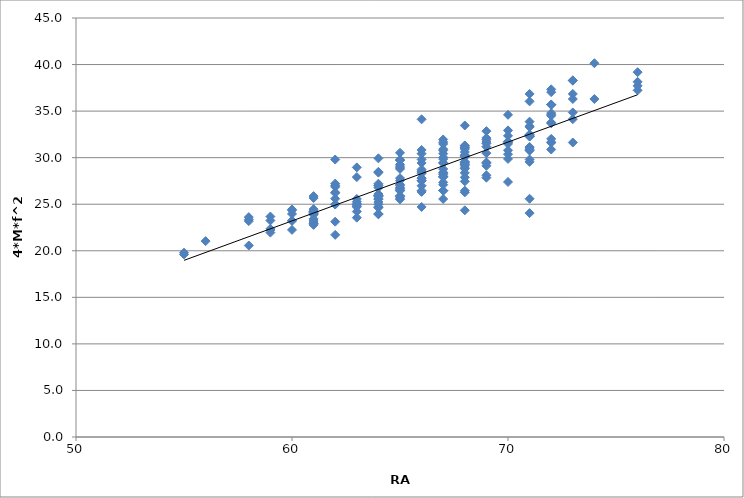
| Category | Series 0 |
|---|---|
| 55.0 | 19.792 |
| 55.0 | 19.607 |
| 56.0 | 21.037 |
| 58.0 | 23.615 |
| 58.0 | 23.348 |
| 58.0 | 23.187 |
| 58.0 | 20.568 |
| 59.0 | 23.675 |
| 59.0 | 23.254 |
| 59.0 | 22.359 |
| 59.0 | 22.222 |
| 59.0 | 21.955 |
| 60.0 | 24.439 |
| 60.0 | 24.349 |
| 60.0 | 23.959 |
| 60.0 | 23.254 |
| 60.0 | 23.198 |
| 60.0 | 22.243 |
| 61.0 | 25.872 |
| 61.0 | 25.661 |
| 61.0 | 24.471 |
| 61.0 | 24.254 |
| 61.0 | 24.226 |
| 61.0 | 24.185 |
| 61.0 | 24.096 |
| 61.0 | 23.989 |
| 61.0 | 23.874 |
| 61.0 | 23.424 |
| 61.0 | 23.202 |
| 61.0 | 22.965 |
| 61.0 | 22.964 |
| 61.0 | 22.781 |
| 62.0 | 29.801 |
| 62.0 | 27.212 |
| 62.0 | 27.02 |
| 62.0 | 26.861 |
| 62.0 | 26.277 |
| 62.0 | 26.21 |
| 62.0 | 25.595 |
| 62.0 | 25.007 |
| 62.0 | 24.966 |
| 62.0 | 23.128 |
| 62.0 | 21.71 |
| 63.0 | 28.956 |
| 63.0 | 27.913 |
| 63.0 | 25.566 |
| 63.0 | 25.275 |
| 63.0 | 25.078 |
| 63.0 | 24.948 |
| 63.0 | 24.807 |
| 63.0 | 24.711 |
| 63.0 | 24.215 |
| 63.0 | 23.557 |
| 64.0 | 29.927 |
| 64.0 | 28.478 |
| 64.0 | 28.396 |
| 64.0 | 27.205 |
| 64.0 | 27.04 |
| 64.0 | 26.985 |
| 64.0 | 26.784 |
| 64.0 | 26.093 |
| 64.0 | 25.976 |
| 64.0 | 25.934 |
| 64.0 | 25.934 |
| 64.0 | 25.891 |
| 64.0 | 25.813 |
| 64.0 | 25.569 |
| 64.0 | 25.526 |
| 64.0 | 25.233 |
| 64.0 | 24.982 |
| 64.0 | 24.708 |
| 64.0 | 24.681 |
| 64.0 | 24.626 |
| 64.0 | 23.977 |
| 64.0 | 23.912 |
| 65.0 | 30.525 |
| 65.0 | 29.79 |
| 65.0 | 29.702 |
| 65.0 | 29.702 |
| 65.0 | 29.267 |
| 65.0 | 29.089 |
| 65.0 | 28.913 |
| 65.0 | 28.788 |
| 65.0 | 27.804 |
| 65.0 | 27.537 |
| 65.0 | 27.114 |
| 65.0 | 26.996 |
| 65.0 | 26.81 |
| 65.0 | 26.697 |
| 65.0 | 26.548 |
| 65.0 | 26.462 |
| 65.0 | 26.449 |
| 65.0 | 25.891 |
| 65.0 | 25.876 |
| 65.0 | 25.813 |
| 65.0 | 25.65 |
| 65.0 | 25.52 |
| 66.0 | 34.119 |
| 66.0 | 30.827 |
| 66.0 | 30.432 |
| 66.0 | 29.813 |
| 66.0 | 29.43 |
| 66.0 | 28.734 |
| 66.0 | 28.552 |
| 66.0 | 28.478 |
| 66.0 | 28.3 |
| 66.0 | 27.804 |
| 66.0 | 27.796 |
| 66.0 | 27.54 |
| 66.0 | 27.504 |
| 66.0 | 26.985 |
| 66.0 | 26.459 |
| 66.0 | 26.323 |
| 66.0 | 24.708 |
| 67.0 | 31.955 |
| 67.0 | 31.67 |
| 67.0 | 31.472 |
| 67.0 | 30.918 |
| 67.0 | 30.775 |
| 67.0 | 30.432 |
| 67.0 | 30.035 |
| 67.0 | 29.85 |
| 67.0 | 29.475 |
| 67.0 | 29.398 |
| 67.0 | 28.782 |
| 67.0 | 28.417 |
| 67.0 | 28.35 |
| 67.0 | 28.198 |
| 67.0 | 28.002 |
| 67.0 | 27.967 |
| 67.0 | 27.908 |
| 67.0 | 27.355 |
| 67.0 | 27.088 |
| 67.0 | 26.463 |
| 67.0 | 26.46 |
| 67.0 | 26.46 |
| 67.0 | 25.563 |
| 68.0 | 33.459 |
| 68.0 | 31.313 |
| 68.0 | 31.245 |
| 68.0 | 31.058 |
| 68.0 | 31.05 |
| 68.0 | 30.926 |
| 68.0 | 30.607 |
| 68.0 | 30.282 |
| 68.0 | 30.232 |
| 68.0 | 30.157 |
| 68.0 | 30.072 |
| 68.0 | 29.579 |
| 68.0 | 29.483 |
| 68.0 | 29.435 |
| 68.0 | 29.307 |
| 68.0 | 29.301 |
| 68.0 | 29.127 |
| 68.0 | 28.889 |
| 68.0 | 28.819 |
| 68.0 | 28.364 |
| 68.0 | 27.89 |
| 68.0 | 27.45 |
| 68.0 | 26.46 |
| 68.0 | 26.277 |
| 68.0 | 24.344 |
| 69.0 | 32.85 |
| 69.0 | 32.117 |
| 69.0 | 31.929 |
| 69.0 | 31.682 |
| 69.0 | 31.521 |
| 69.0 | 31.181 |
| 69.0 | 30.483 |
| 69.0 | 29.495 |
| 69.0 | 29.402 |
| 69.0 | 29.124 |
| 69.0 | 28.112 |
| 69.0 | 27.853 |
| 70.0 | 34.604 |
| 70.0 | 32.931 |
| 70.0 | 32.351 |
| 70.0 | 31.744 |
| 70.0 | 31.714 |
| 70.0 | 31.648 |
| 70.0 | 31.477 |
| 70.0 | 30.794 |
| 70.0 | 30.368 |
| 70.0 | 29.864 |
| 70.0 | 27.388 |
| 71.0 | 36.844 |
| 71.0 | 36.046 |
| 71.0 | 33.871 |
| 71.0 | 33.382 |
| 71.0 | 33.292 |
| 71.0 | 32.484 |
| 71.0 | 32.452 |
| 71.0 | 32.351 |
| 71.0 | 32.318 |
| 71.0 | 32.282 |
| 71.0 | 32.275 |
| 71.0 | 31.15 |
| 71.0 | 31.053 |
| 71.0 | 30.863 |
| 71.0 | 30.752 |
| 71.0 | 29.805 |
| 71.0 | 29.55 |
| 71.0 | 25.585 |
| 71.0 | 24.044 |
| 72.0 | 37.339 |
| 72.0 | 37.037 |
| 72.0 | 35.709 |
| 72.0 | 35.692 |
| 72.0 | 35.675 |
| 72.0 | 34.791 |
| 72.0 | 34.61 |
| 72.0 | 34.5 |
| 72.0 | 33.781 |
| 72.0 | 33.689 |
| 72.0 | 32.021 |
| 72.0 | 31.674 |
| 72.0 | 31.598 |
| 72.0 | 30.877 |
| 73.0 | 38.309 |
| 73.0 | 38.264 |
| 73.0 | 36.844 |
| 73.0 | 36.298 |
| 73.0 | 34.857 |
| 73.0 | 34.136 |
| 73.0 | 31.63 |
| 74.0 | 40.143 |
| 74.0 | 36.299 |
| 76.0 | 39.183 |
| 76.0 | 38.148 |
| 76.0 | 37.714 |
| 76.0 | 37.231 |